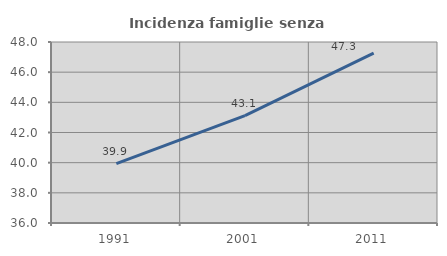
| Category | Incidenza famiglie senza nuclei |
|---|---|
| 1991.0 | 39.936 |
| 2001.0 | 43.122 |
| 2011.0 | 47.267 |